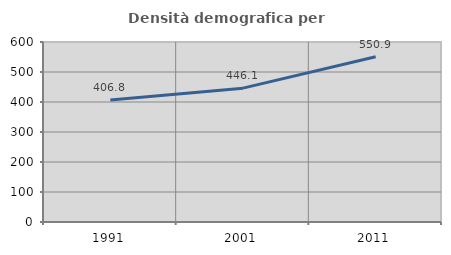
| Category | Densità demografica |
|---|---|
| 1991.0 | 406.787 |
| 2001.0 | 446.136 |
| 2011.0 | 550.924 |